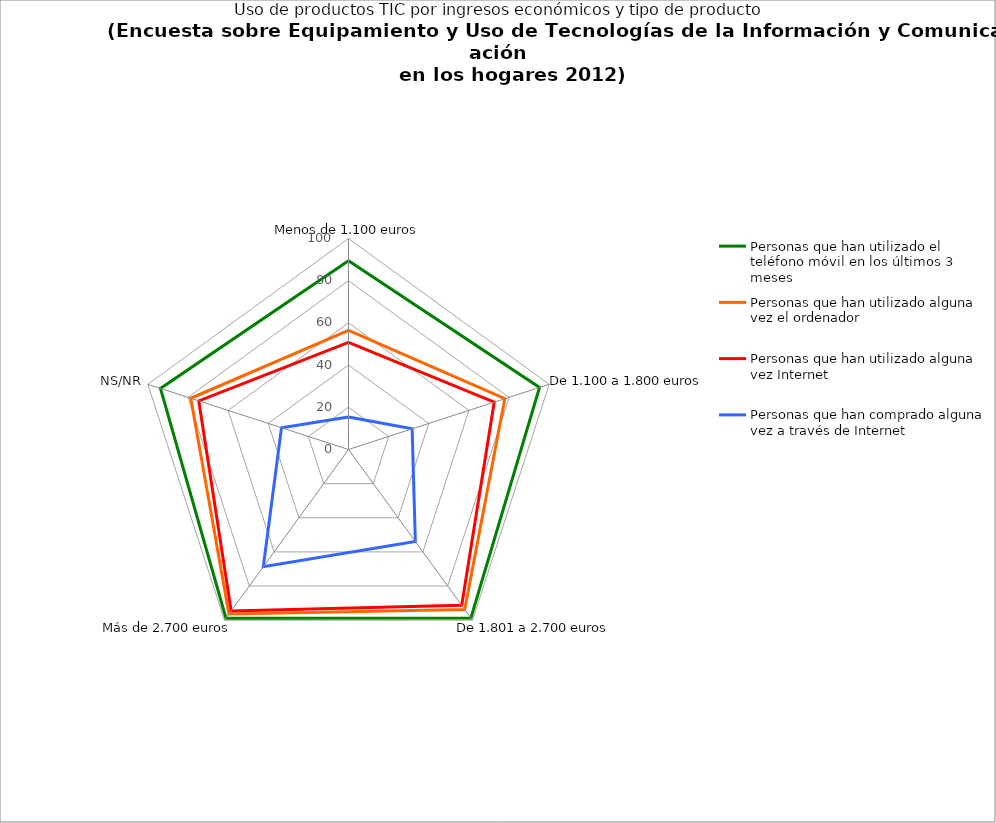
| Category | Personas que han utilizado el teléfono móvil en los últimos 3 meses | Personas que han utilizado alguna vez el ordenador | Personas que han utilizado alguna vez Internet | Personas que han comprado alguna vez a través de Internet |
|---|---|---|---|---|
|  Menos de 1.100 euros | 89.4 | 56.4 | 50.8 | 15.4 |
| De 1.100 a 1.800 euros | 95.2 | 77.9 | 72.6 | 31.7 |
| De 1.801 a 2.700 euros | 98.7 | 93.7 | 91.3 | 53.9 |
| Más de 2.700 euros | 98.8 | 96.4 | 94.6 | 68.7 |
|  NS/NR | 93.7 | 78.6 | 74.6 | 33.4 |